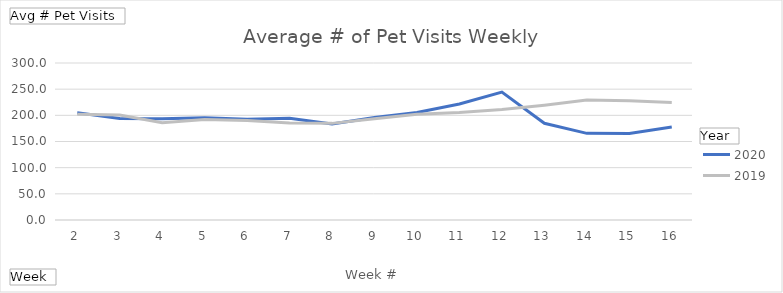
| Category | 2020 | 2019 |
|---|---|---|
| 2 | 204.815 | 202.204 |
| 3 | 193.843 | 200.5 |
| 4 | 193.694 | 185.981 |
| 5 | 195.444 | 192.13 |
| 6 | 192.426 | 190.028 |
| 7 | 194.352 | 185.426 |
| 8 | 183.25 | 184.648 |
| 9 | 195.769 | 193.62 |
| 10 | 205.444 | 202.287 |
| 11 | 221.759 | 205.398 |
| 12 | 244.278 | 211.074 |
| 13 | 184.722 | 219.454 |
| 14 | 165.528 | 229.417 |
| 15 | 165.168 | 227.657 |
| 16 | 177.771 | 224.694 |